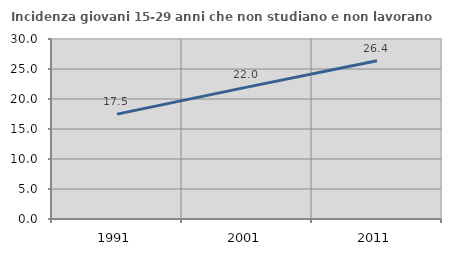
| Category | Incidenza giovani 15-29 anni che non studiano e non lavorano  |
|---|---|
| 1991.0 | 17.48 |
| 2001.0 | 21.978 |
| 2011.0 | 26.364 |